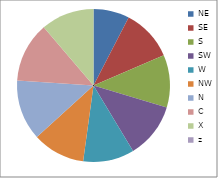
| Category | Series 0 |
|---|---|
| NE | 6.342 |
| SE | 9.11 |
| S | 9.292 |
| SW | 9.768 |
| W | 9.023 |
| NW | 9.269 |
| N | 10.647 |
| C | 10.604 |
| X | 9.4 |
| z | 0 |